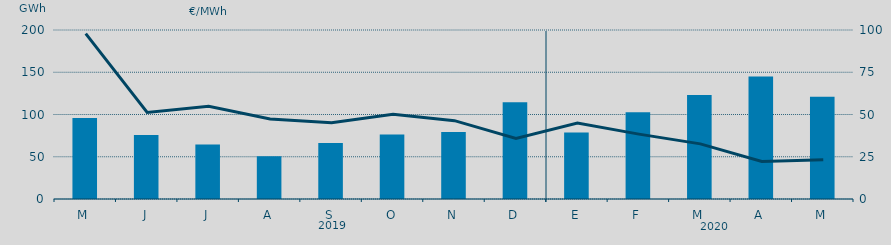
| Category | Energía a subir |
|---|---|
| M | 95.806 |
| J | 75.708 |
| J | 64.438 |
| A | 50.596 |
| S | 66.317 |
| O | 76.273 |
| N | 79.309 |
| D | 114.385 |
| E | 78.585 |
| F | 102.74 |
| M | 123.158 |
| A | 144.862 |
| M | 120.894 |